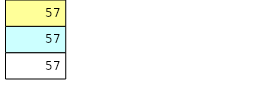
| Category | Total Standouts | Total Recd | Total Tipsters |
|---|---|---|---|
| 0 | 57 | 57 | 57 |